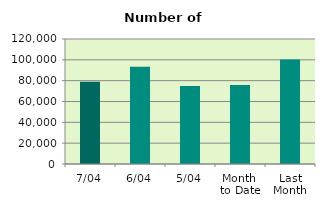
| Category | Series 0 |
|---|---|
| 7/04 | 79040 |
| 6/04 | 93334 |
| 5/04 | 74794 |
| Month 
to Date | 75771.2 |
| Last
Month | 100276.783 |